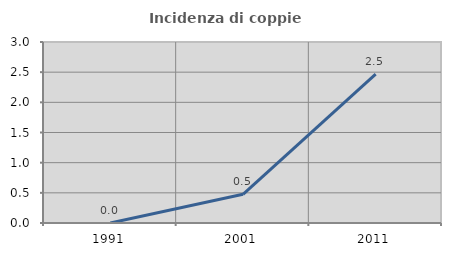
| Category | Incidenza di coppie miste |
|---|---|
| 1991.0 | 0 |
| 2001.0 | 0.476 |
| 2011.0 | 2.466 |